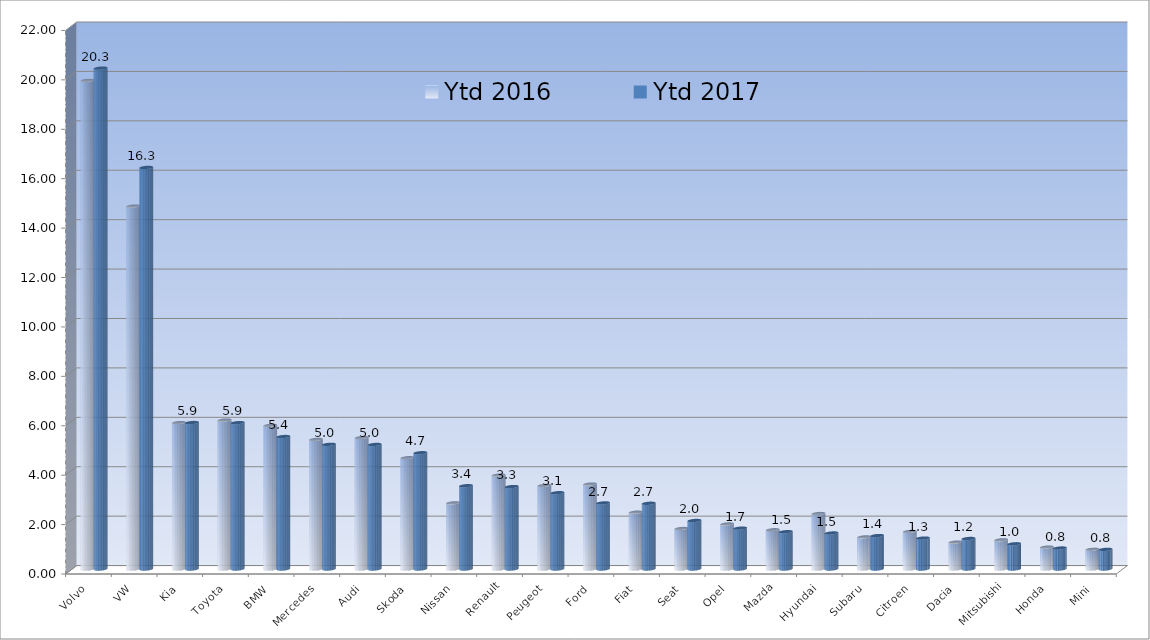
| Category | Ytd 2016 | Ytd 2017 |
|---|---|---|
| Volvo | 19.776 | 20.272 |
| VW | 14.687 | 16.254 |
| Kia | 5.925 | 5.928 |
| Toyota | 6.027 | 5.923 |
| BMW | 5.813 | 5.361 |
| Mercedes | 5.244 | 5.046 |
| Audi | 5.319 | 5.04 |
| Skoda | 4.504 | 4.706 |
| Nissan | 2.675 | 3.371 |
| Renault | 3.801 | 3.336 |
| Peugeot | 3.381 | 3.087 |
| Ford | 3.437 | 2.674 |
| Fiat | 2.3 | 2.66 |
| Seat | 1.639 | 1.964 |
| Opel | 1.822 | 1.653 |
| Mazda | 1.587 | 1.51 |
| Hyundai | 2.244 | 1.457 |
| Subaru | 1.298 | 1.352 |
| Citroen | 1.52 | 1.252 |
| Dacia | 1.089 | 1.235 |
| Mitsubishi | 1.18 | 1.02 |
| Honda | 0.887 | 0.849 |
| Mini | 0.799 | 0.795 |